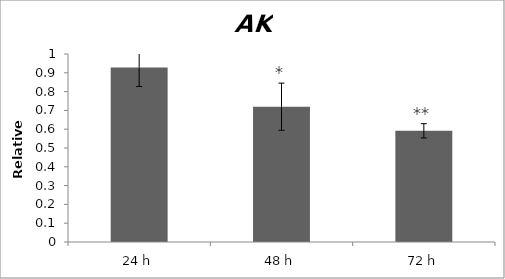
| Category | Series 0 |
|---|---|
| 24 h | 0.928 |
| 48 h | 0.72 |
| 72 h | 0.592 |